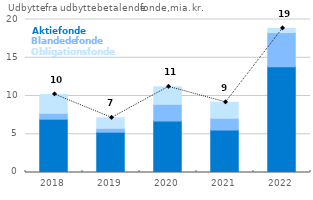
| Category | Aktiefonde | Blandede fonde | Obligationsfonde |
|---|---|---|---|
| 2018.0 | 6.97 | 0.77 | 2.45 |
| 2019.0 | 5.27 | 0.51 | 1.37 |
| 2020.0 | 6.73 | 2.18 | 2.29 |
| 2021.0 | 5.55 | 1.54 | 2.09 |
| 2022.0 | 13.83 | 4.46 | 0.55 |